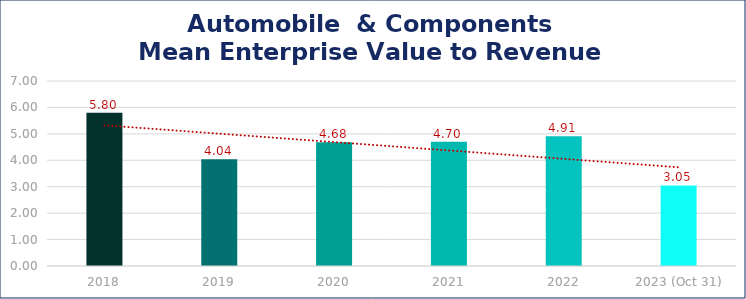
| Category | Automobile  & Components |
|---|---|
| 2018 | 5.8 |
| 2019 | 4.04 |
| 2020 | 4.68 |
| 2021 | 4.7 |
| 2022 | 4.91 |
| 2023 (Oct 31) | 3.05 |